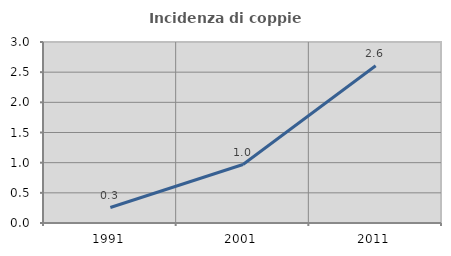
| Category | Incidenza di coppie miste |
|---|---|
| 1991.0 | 0.256 |
| 2001.0 | 0.969 |
| 2011.0 | 2.607 |